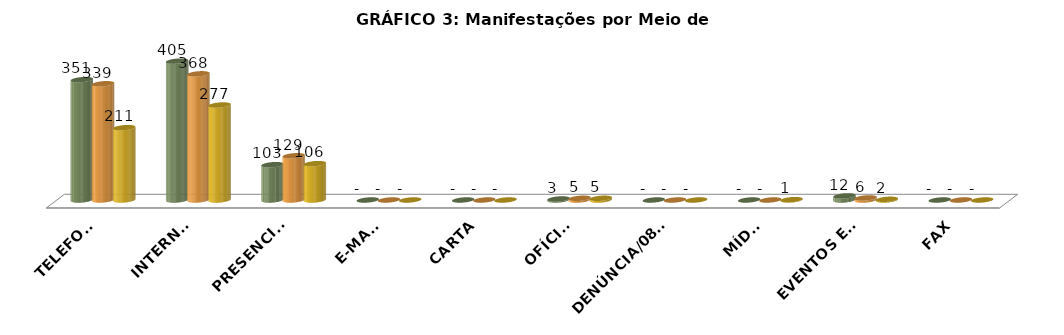
| Category | ABRIL | MAIO | JUNHO |
|---|---|---|---|
| TELEFONE | 351 | 339 | 211 |
| INTERNET | 405 | 368 | 277 |
| PRESENCIAL | 103 | 129 | 106 |
| E-MAIL | 0 | 0 | 0 |
| CARTA | 0 | 0 | 0 |
| OFÍCIO | 3 | 5 | 5 |
| DENÚNCIA/0800 | 0 | 0 | 0 |
| MÍDIA | 0 | 0 | 1 |
| EVENTOS EXT | 12 | 6 | 2 |
| FAX | 0 | 0 | 0 |